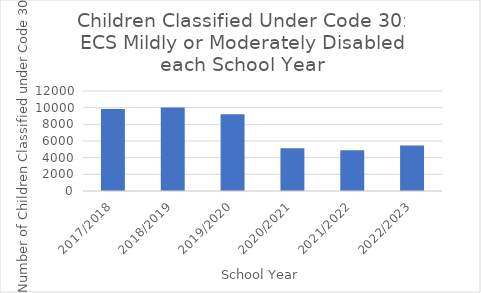
| Category | Series 0 |
|---|---|
| 2017/2018 | 9831 |
| 2018/2019 | 10026 |
| 2019/2020 | 9207 |
| 2020/2021 | 5124 |
| 2021/2022 | 4891 |
| 2022/2023 | 5466 |